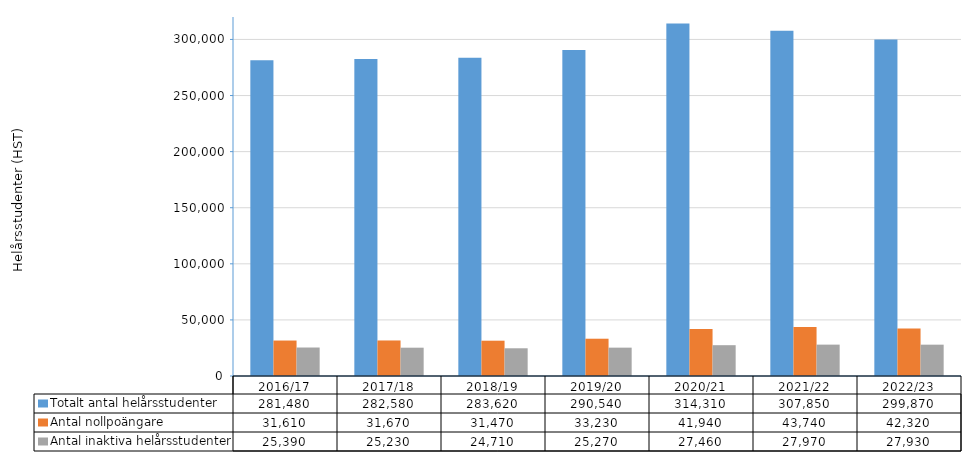
| Category | Totalt antal helårsstudenter | Antal nollpoängare | Antal inaktiva helårsstudenter |
|---|---|---|---|
| 2016/17 | 281480 | 31610 | 25390 |
| 2017/18 | 282580 | 31670 | 25230 |
| 2018/19 | 283620 | 31470 | 24710 |
| 2019/20 | 290540 | 33230 | 25270 |
| 2020/21 | 314310 | 41940 | 27460 |
| 2021/22 | 307850 | 43740 | 27970 |
| 2022/23 | 299870 | 42320 | 27930 |